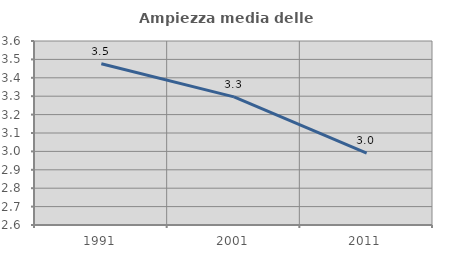
| Category | Ampiezza media delle famiglie |
|---|---|
| 1991.0 | 3.477 |
| 2001.0 | 3.296 |
| 2011.0 | 2.991 |